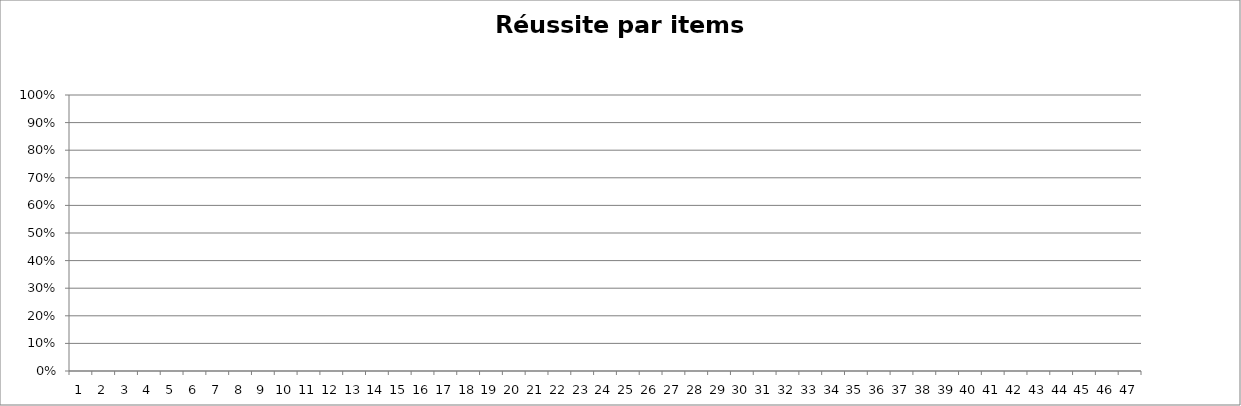
| Category | Series 0 |
|---|---|
| 0 | 0 |
| 1 | 0 |
| 2 | 0 |
| 3 | 0 |
| 4 | 0 |
| 5 | 0 |
| 6 | 0 |
| 7 | 0 |
| 8 | 0 |
| 9 | 0 |
| 10 | 0 |
| 11 | 0 |
| 12 | 0 |
| 13 | 0 |
| 14 | 0 |
| 15 | 0 |
| 16 | 0 |
| 17 | 0 |
| 18 | 0 |
| 19 | 0 |
| 20 | 0 |
| 21 | 0 |
| 22 | 0 |
| 23 | 0 |
| 24 | 0 |
| 25 | 0 |
| 26 | 0 |
| 27 | 0 |
| 28 | 0 |
| 29 | 0 |
| 30 | 0 |
| 31 | 0 |
| 32 | 0 |
| 33 | 0 |
| 34 | 0 |
| 35 | 0 |
| 36 | 0 |
| 37 | 0 |
| 38 | 0 |
| 39 | 0 |
| 40 | 0 |
| 41 | 0 |
| 42 | 0 |
| 43 | 0 |
| 44 | 0 |
| 45 | 0 |
| 46 | 0 |